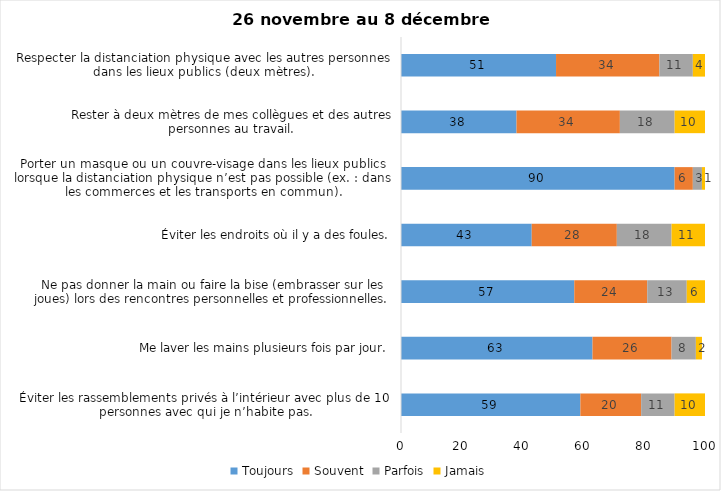
| Category | Toujours | Souvent | Parfois | Jamais |
|---|---|---|---|---|
| Éviter les rassemblements privés à l’intérieur avec plus de 10 personnes avec qui je n’habite pas. | 59 | 20 | 11 | 10 |
| Me laver les mains plusieurs fois par jour. | 63 | 26 | 8 | 2 |
| Ne pas donner la main ou faire la bise (embrasser sur les joues) lors des rencontres personnelles et professionnelles. | 57 | 24 | 13 | 6 |
| Éviter les endroits où il y a des foules. | 43 | 28 | 18 | 11 |
| Porter un masque ou un couvre-visage dans les lieux publics lorsque la distanciation physique n’est pas possible (ex. : dans les commerces et les transports en commun). | 90 | 6 | 3 | 1 |
| Rester à deux mètres de mes collègues et des autres personnes au travail. | 38 | 34 | 18 | 10 |
| Respecter la distanciation physique avec les autres personnes dans les lieux publics (deux mètres). | 51 | 34 | 11 | 4 |